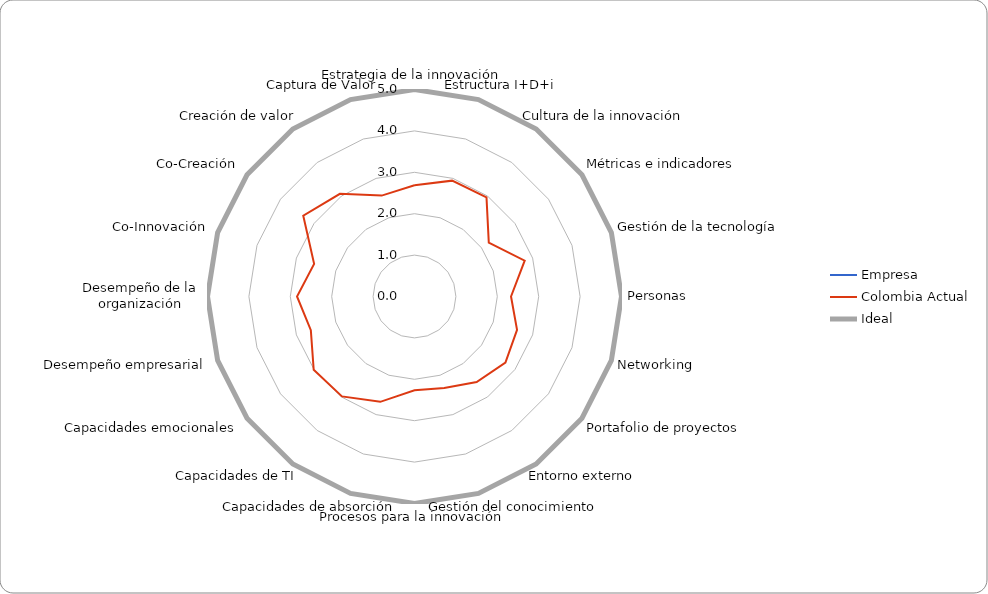
| Category | Empresa | Colombia Actual | Ideal |
|---|---|---|---|
| Estrategia de la innovación | 0 | 2.688 | 5 |
| Estructura I+D+i | 0 | 2.942 | 5 |
| Cultura de la innovación | 0 | 2.959 | 5 |
| Métricas e indicadores | 0 | 2.218 | 5 |
| Gestión de la tecnología | 0 | 2.799 | 5 |
| Personas | 0 | 2.332 | 5 |
| Networking | 0 | 2.604 | 5 |
| Portafolio de proyectos | 0 | 2.715 | 5 |
| Entorno externo | 0 | 2.554 | 5 |
| Gestión del conocimiento | 0 | 2.324 | 5 |
| Procesos para la innovación | 0 | 2.267 | 5 |
| Capacidades de absorción | 0 | 2.675 | 5 |
| Capacidades de TI | 0 | 2.982 | 5 |
| Capacidades emocionales | 0 | 3.01 | 5 |
| Desempeño empresarial | 0 | 2.633 | 5 |
| Desempeño de la organización | 0 | 2.838 | 5 |
| Co-Innovación | 0 | 2.55 | 5 |
| Co-Creación | 0 | 3.321 | 5 |
| Creación de valor | 0 | 3.066 | 5 |
| Captura de Valor | 0 | 2.563 | 5 |